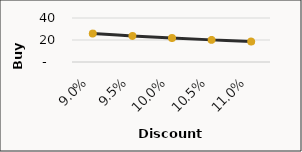
| Category | Discount Rates vs. Buy Prices |
|---|---|
| 0.09 | 25.841 |
| 0.095 | 23.677 |
| 0.1 | 21.784 |
| 0.10500000000000001 | 20.115 |
| 0.11000000000000001 | 18.631 |